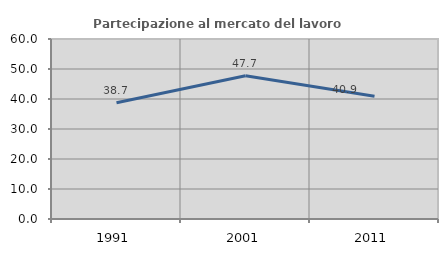
| Category | Partecipazione al mercato del lavoro  femminile |
|---|---|
| 1991.0 | 38.734 |
| 2001.0 | 47.722 |
| 2011.0 | 40.929 |